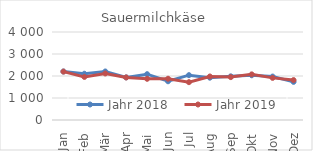
| Category | Jahr 2018 | Jahr 2019 |
|---|---|---|
| Jan | 2204.389 | 2200.754 |
| Feb | 2102.964 | 1958.274 |
| Mär | 2205.312 | 2115.07 |
| Apr | 1936.813 | 1934.601 |
| Mai | 2082.656 | 1872.534 |
| Jun | 1760.534 | 1875.16 |
| Jul | 2038.425 | 1720.093 |
| Aug | 1923.733 | 1978.045 |
| Sep | 1984.568 | 1949.84 |
| Okt | 2032.997 | 2074.121 |
| Nov | 1974.176 | 1914.871 |
| Dez | 1733.345 | 1813.851 |